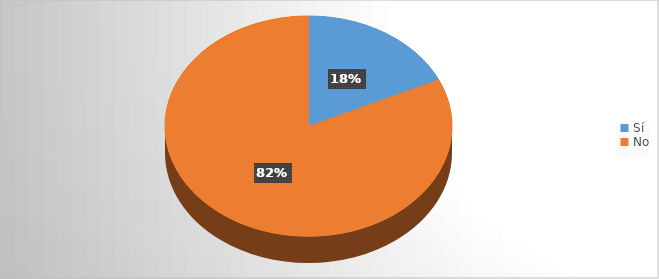
| Category | Series 0 |
|---|---|
| Sí | 73 |
| No | 332 |